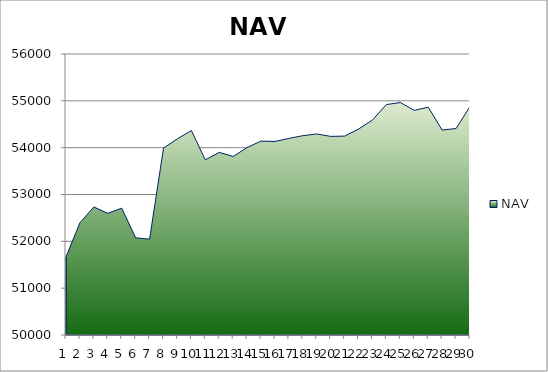
| Category | NAV |
|---|---|
| 0 | 51667 |
| 1 | 52397 |
| 2 | 52733.957 |
| 3 | 52597.875 |
| 4 | 52708.772 |
| 5 | 52075.184 |
| 6 | 52046.775 |
| 7 | 53991.219 |
| 8 | 54189.909 |
| 9 | 54364.909 |
| 10 | 53739.909 |
| 11 | 53899.542 |
| 12 | 53812.294 |
| 13 | 54003.961 |
| 14 | 54140.037 |
| 15 | 54132.37 |
| 16 | 54197.37 |
| 17 | 54255.812 |
| 18 | 54292.622 |
| 19 | 54240.699 |
| 20 | 54246.834 |
| 21 | 54397.391 |
| 22 | 54592.197 |
| 23 | 54920.119 |
| 24 | 54963.245 |
| 25 | 54796.799 |
| 26 | 54863.963 |
| 27 | 54375.975 |
| 28 | 54409.015 |
| 29 | 54878.402 |